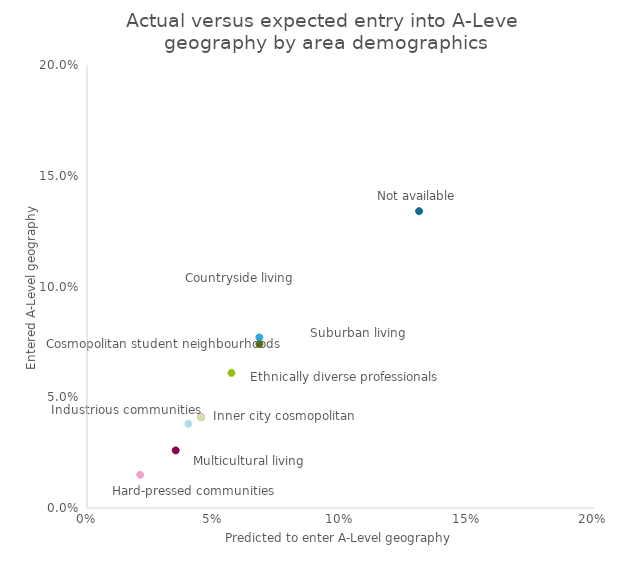
| Category | Series 0 |
|---|---|
| 0.045 | 0.041 |
| 0.068 | 0.077 |
| 0.057 | 0.061 |
| 0.021 | 0.015 |
| 0.04 | 0.038 |
| 0.045 | 0.041 |
| 0.035 | 0.026 |
| 0.131 | 0.134 |
| 0.068 | 0.074 |